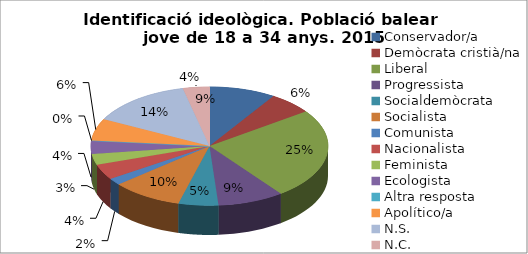
| Category | Series 0 |
|---|---|
| Conservador/a | 0.09 |
| Demòcrata cristià/na | 0.06 |
| Liberal | 0.247 |
| Progressista | 0.09 |
| Socialdemòcrata | 0.054 |
| Socialista | 0.096 |
| Comunista | 0.018 |
| Nacionalista | 0.042 |
| Feminista | 0.03 |
| Ecologista | 0.036 |
| Altra resposta | 0 |
| Apolítico/a | 0.06 |
| N.S. | 0.139 |
| N.C. | 0.036 |